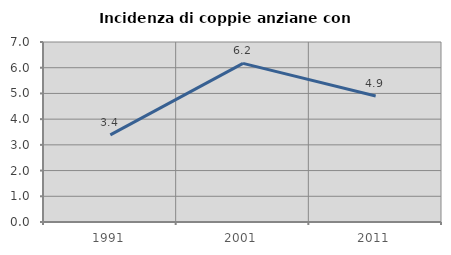
| Category | Incidenza di coppie anziane con figli |
|---|---|
| 1991.0 | 3.386 |
| 2001.0 | 6.168 |
| 2011.0 | 4.9 |